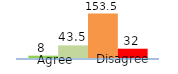
| Category | Series 0 | Series 1 | Series 2 | Series 3 |
|---|---|---|---|---|
| 0 | 8 | 43.5 | 153.5 | 32 |